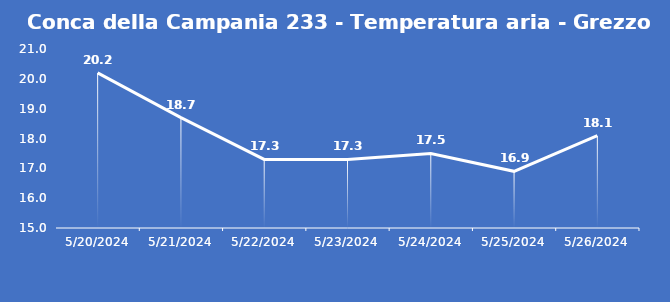
| Category | Conca della Campania 233 - Temperatura aria - Grezzo (°C) |
|---|---|
| 5/20/24 | 20.2 |
| 5/21/24 | 18.7 |
| 5/22/24 | 17.3 |
| 5/23/24 | 17.3 |
| 5/24/24 | 17.5 |
| 5/25/24 | 16.9 |
| 5/26/24 | 18.1 |